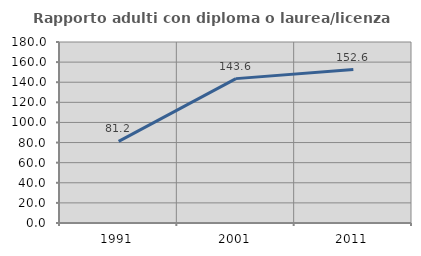
| Category | Rapporto adulti con diploma o laurea/licenza media  |
|---|---|
| 1991.0 | 81.188 |
| 2001.0 | 143.578 |
| 2011.0 | 152.569 |